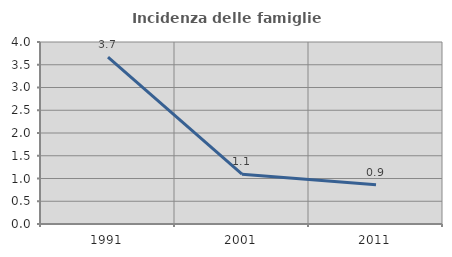
| Category | Incidenza delle famiglie numerose |
|---|---|
| 1991.0 | 3.667 |
| 2001.0 | 1.094 |
| 2011.0 | 0.864 |